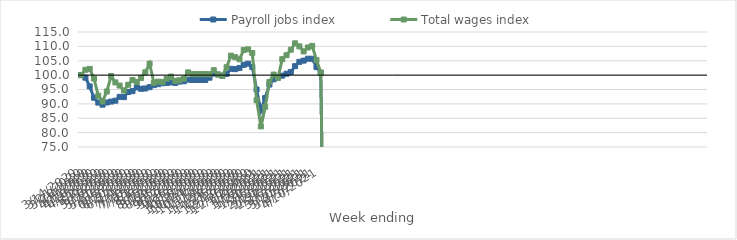
| Category | Payroll jobs index | Total wages index |
|---|---|---|
| 14/03/2020 | 100 | 100 |
| 21/03/2020 | 99.116 | 101.854 |
| 28/03/2020 | 96.079 | 102.174 |
| 04/04/2020 | 92.143 | 98.809 |
| 11/04/2020 | 90.448 | 92.846 |
| 18/04/2020 | 89.72 | 90.846 |
| 25/04/2020 | 90.479 | 94.307 |
| 02/05/2020 | 90.803 | 99.671 |
| 09/05/2020 | 91.113 | 97.458 |
| 16/05/2020 | 92.438 | 96.362 |
| 23/05/2020 | 92.347 | 94.631 |
| 30/05/2020 | 94.147 | 96.647 |
| 06/06/2020 | 94.432 | 98.311 |
| 13/06/2020 | 95.726 | 97.603 |
| 20/06/2020 | 95.256 | 99.038 |
| 27/06/2020 | 95.35 | 100.99 |
| 04/07/2020 | 95.825 | 103.972 |
| 11/07/2020 | 96.522 | 97.341 |
| 18/07/2020 | 96.853 | 97.726 |
| 25/07/2020 | 97.199 | 97.644 |
| 01/08/2020 | 97.294 | 98.781 |
| 08/08/2020 | 97.472 | 99.503 |
| 15/08/2020 | 97.288 | 98.001 |
| 22/08/2020 | 97.76 | 98.234 |
| 29/08/2020 | 97.867 | 98.766 |
| 05/09/2020 | 98.431 | 100.955 |
| 12/09/2020 | 98.308 | 100.35 |
| 19/09/2020 | 98.308 | 100.35 |
| 26/09/2020 | 98.308 | 100.35 |
| 03/10/2020 | 98.308 | 100.35 |
| 10/10/2020 | 99.106 | 100.306 |
| 17/10/2020 | 100.545 | 101.718 |
| 24/10/2020 | 100.22 | 100.206 |
| 31/10/2020 | 99.78 | 99.81 |
| 07/11/2020 | 100.445 | 102.75 |
| 14/11/2020 | 102.192 | 106.769 |
| 21/11/2020 | 102.084 | 106.241 |
| 28/11/2020 | 102.502 | 105.509 |
| 05/12/2020 | 103.578 | 108.781 |
| 12/12/2020 | 103.984 | 108.961 |
| 19/12/2020 | 102.844 | 107.698 |
| 26/12/2020 | 94.995 | 91.326 |
| 02/01/2021 | 87.717 | 82.163 |
| 09/01/2021 | 92.026 | 88.971 |
| 16/01/2021 | 96.72 | 97.605 |
| 23/01/2021 | 98.557 | 100.196 |
| 30/01/2021 | 99.213 | 99.022 |
| 06/02/2021 | 99.818 | 105.542 |
| 13/02/2021 | 100.492 | 106.939 |
| 20/02/2021 | 101.088 | 108.834 |
| 27/02/2021 | 103.126 | 111.069 |
| 06/03/2021 | 104.619 | 110.008 |
| 13/03/2021 | 105.05 | 108.249 |
| 20/03/2021 | 105.702 | 109.62 |
| 27/03/2021 | 105.695 | 110.175 |
| 03/04/2021 | 102.78 | 105.253 |
| 10/04/2021 | 100.839 | 100.863 |